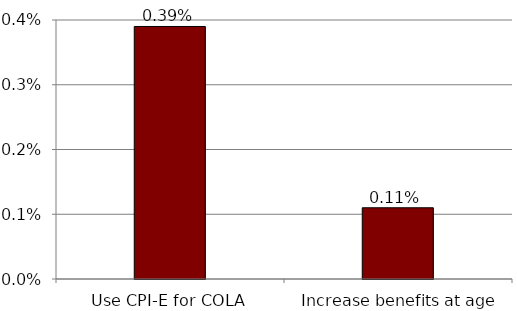
| Category | Series 0 |
|---|---|
| Use CPI-E for COLA | 0.004 |
| Increase benefits at age 85a     | 0.001 |